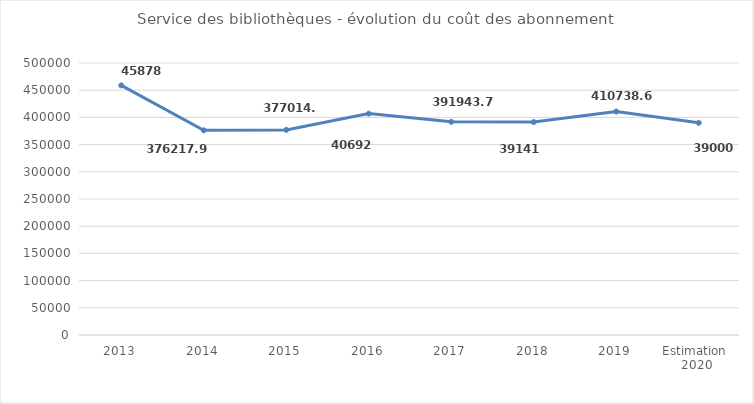
| Category | Service des bibliothèques - évolution du coût des abonnements  |
|---|---|
| 2013 | 458784 |
| 2014 | 376217.91 |
| 2015 | 377014.5 |
| 2016 | 406926 |
| 2017 | 391943.76 |
| 2018 | 391416 |
| 2019 | 410738.64 |
| Estimation   2020  | 390000 |